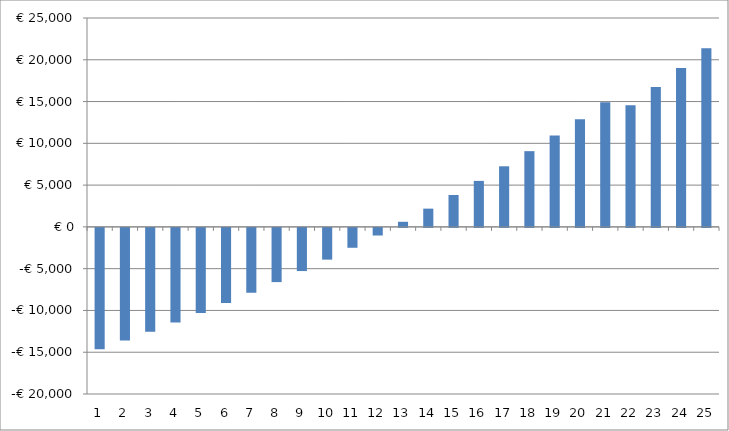
| Category | Series 0 |
|---|---|
| 0 | -14518.1 |
| 1 | -13492.094 |
| 2 | -12427.802 |
| 3 | -11324.01 |
| 4 | -10179.459 |
| 5 | -8992.851 |
| 6 | -7762.847 |
| 7 | -6488.06 |
| 8 | -5167.06 |
| 9 | -3798.368 |
| 10 | -2380.458 |
| 11 | -911.75 |
| 12 | 609.386 |
| 13 | 2184.636 |
| 14 | 3815.741 |
| 15 | 5504.501 |
| 16 | 7252.778 |
| 17 | 9062.495 |
| 18 | 10935.64 |
| 19 | 12874.27 |
| 20 | 14930.511 |
| 21 | 14556.56 |
| 22 | 16754.691 |
| 23 | 19027.256 |
| 24 | 21376.685 |